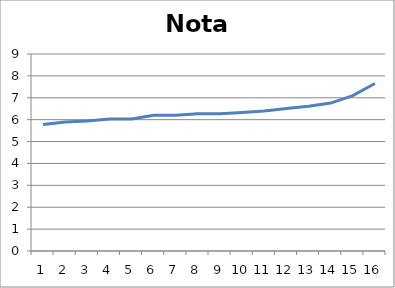
| Category | Nota mitjana |
|---|---|
| 0 | 5.776 |
| 1 | 5.895 |
| 2 | 5.944 |
| 3 | 6.03 |
| 4 | 6.035 |
| 5 | 6.197 |
| 6 | 6.203 |
| 7 | 6.271 |
| 8 | 6.276 |
| 9 | 6.33 |
| 10 | 6.392 |
| 11 | 6.515 |
| 12 | 6.615 |
| 13 | 6.758 |
| 14 | 7.1 |
| 15 | 7.653 |